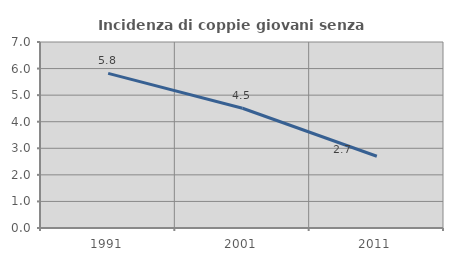
| Category | Incidenza di coppie giovani senza figli |
|---|---|
| 1991.0 | 5.818 |
| 2001.0 | 4.506 |
| 2011.0 | 2.699 |